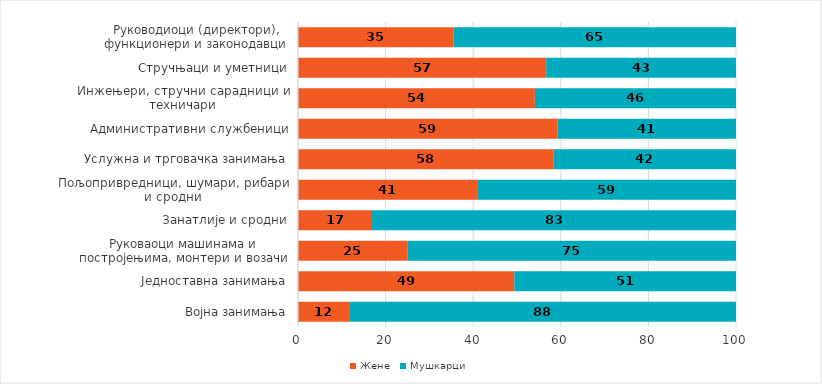
| Category | Жене | Мушкарци |
|---|---|---|
| Војна занимања | 11.688 | 88.312 |
| Једноставна занимања | 49.392 | 50.608 |
| Руковаоци машинама и постројењима, монтери и возачи | 25.049 | 74.951 |
| Занатлије и сродни | 16.896 | 83.104 |
| Пољопривредници, шумари, рибари и сродни | 41.075 | 58.925 |
| Услужна и трговачка занимања | 58.274 | 41.726 |
| Административни службеници | 59.271 | 40.729 |
| Инжењери, стручни сарадници и техничари | 54.078 | 45.922 |
| Стручњаци и уметници | 56.667 | 43.333 |
| Руководиоци (директори), функционери и законодавци | 35.498 | 64.502 |